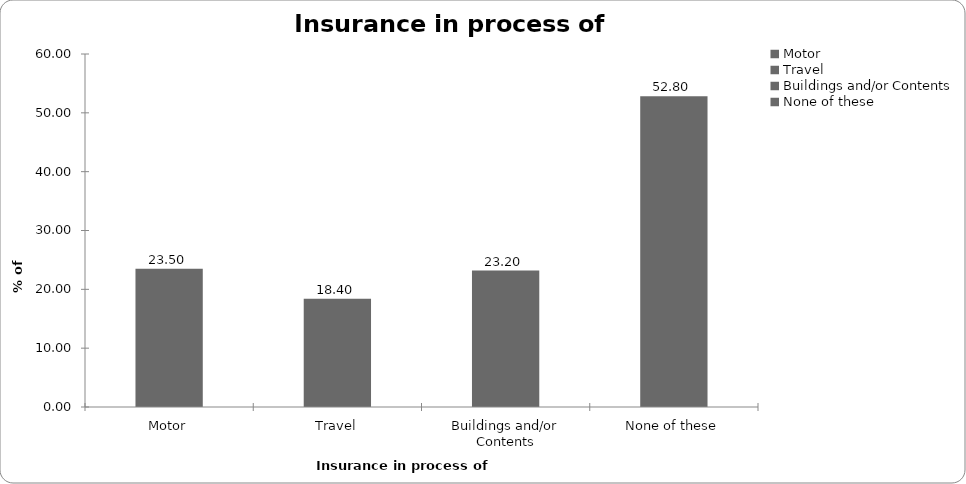
| Category | Insurance in process of buying |
|---|---|
| Motor | 23.5 |
| Travel | 18.4 |
| Buildings and/or Contents | 23.2 |
| None of these | 52.8 |